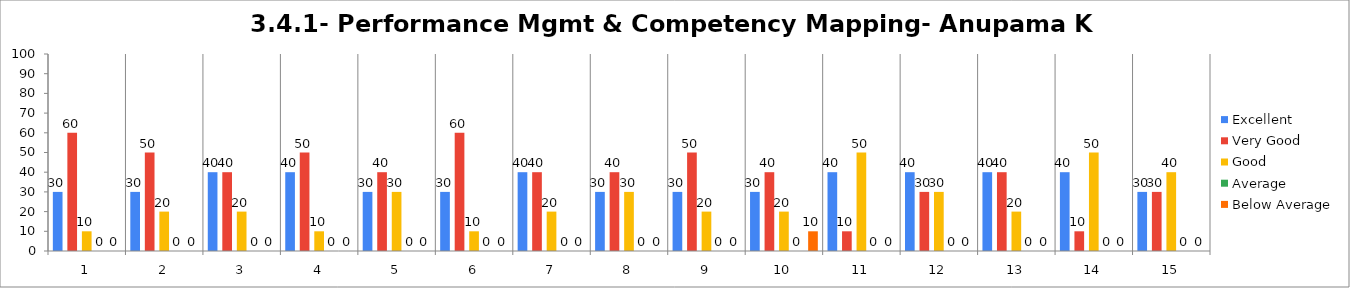
| Category | Excellent | Very Good | Good | Average | Below Average |
|---|---|---|---|---|---|
| 0 | 30 | 60 | 10 | 0 | 0 |
| 1 | 30 | 50 | 20 | 0 | 0 |
| 2 | 40 | 40 | 20 | 0 | 0 |
| 3 | 40 | 50 | 10 | 0 | 0 |
| 4 | 30 | 40 | 30 | 0 | 0 |
| 5 | 30 | 60 | 10 | 0 | 0 |
| 6 | 40 | 40 | 20 | 0 | 0 |
| 7 | 30 | 40 | 30 | 0 | 0 |
| 8 | 30 | 50 | 20 | 0 | 0 |
| 9 | 30 | 40 | 20 | 0 | 10 |
| 10 | 40 | 10 | 50 | 0 | 0 |
| 11 | 40 | 30 | 30 | 0 | 0 |
| 12 | 40 | 40 | 20 | 0 | 0 |
| 13 | 40 | 10 | 50 | 0 | 0 |
| 14 | 30 | 30 | 40 | 0 | 0 |